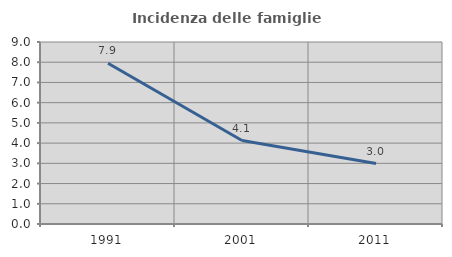
| Category | Incidenza delle famiglie numerose |
|---|---|
| 1991.0 | 7.949 |
| 2001.0 | 4.126 |
| 2011.0 | 2.989 |